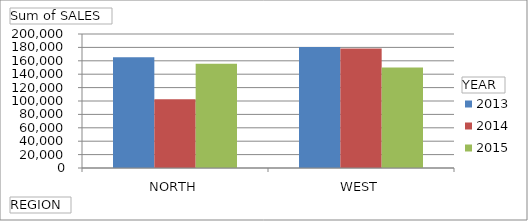
| Category | 2013 | 2014 | 2015 |
|---|---|---|---|
| NORTH | 165399 | 102647 | 155550 |
| WEST | 180462 | 178212 | 150042 |